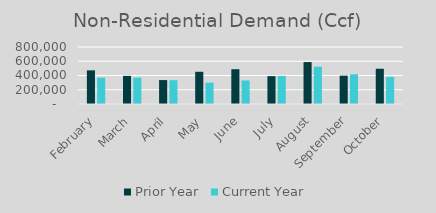
| Category | Prior Year | Current Year |
|---|---|---|
| February | 472459.203 | 369131.684 |
| March | 394966.802 | 370961.851 |
| April | 335781.44 | 333800.488 |
| May | 452130.67 | 299245.56 |
| June | 488107.52 | 330441.187 |
| July | 390975.65 | 394304.316 |
| August | 588468.22 | 522963.473 |
| September | 398263 | 416886.629 |
| October | 494775 | 379515 |